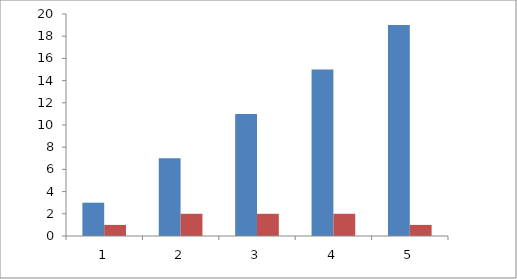
| Category | Series 0 | Series 1 |
|---|---|---|
| 0 | 3 | 1 |
| 1 | 7 | 2 |
| 2 | 11 | 2 |
| 3 | 15 | 2 |
| 4 | 19 | 1 |